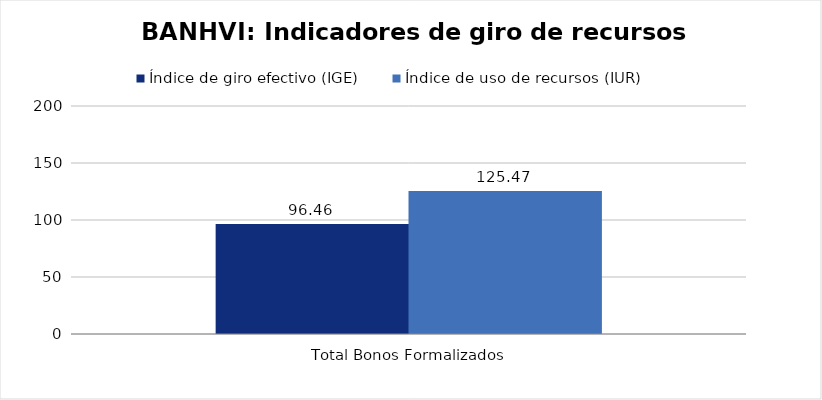
| Category | Índice de giro efectivo (IGE) | Índice de uso de recursos (IUR)  |
|---|---|---|
| Total Bonos Formalizados | 96.459 | 125.473 |